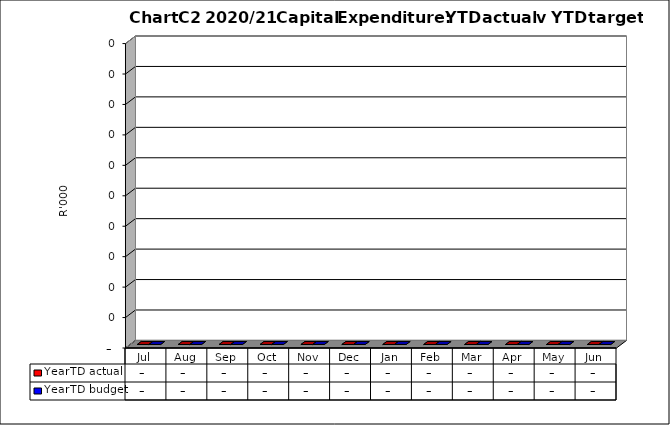
| Category | YearTD actual | YearTD budget |
|---|---|---|
| Jul | 0 | 0 |
| Aug | 0 | 0 |
| Sep | 0 | 0 |
| Oct | 0 | 0 |
| Nov | 0 | 0 |
| Dec | 0 | 0 |
| Jan | 0 | 0 |
| Feb | 0 | 0 |
| Mar | 0 | 0 |
| Apr | 0 | 0 |
| May | 0 | 0 |
| Jun | 0 | 0 |